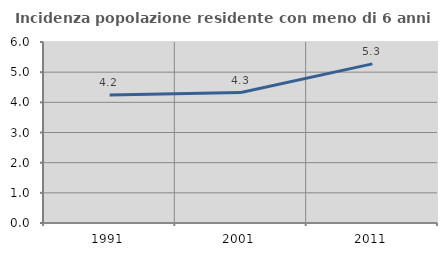
| Category | Incidenza popolazione residente con meno di 6 anni |
|---|---|
| 1991.0 | 4.244 |
| 2001.0 | 4.324 |
| 2011.0 | 5.274 |